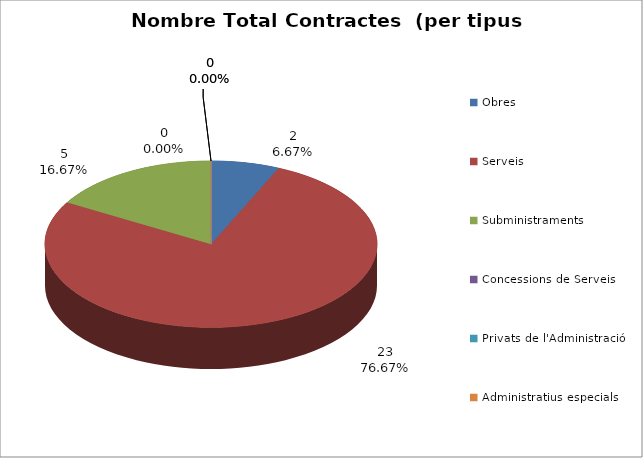
| Category | Nombre Total Contractes |
|---|---|
| Obres | 2 |
| Serveis | 23 |
| Subministraments | 5 |
| Concessions de Serveis | 0 |
| Privats de l'Administració | 0 |
| Administratius especials | 0 |